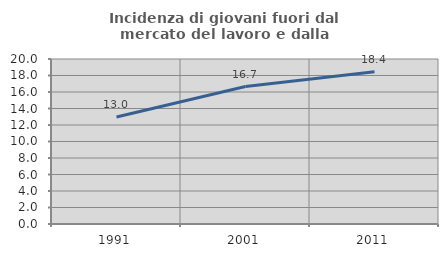
| Category | Incidenza di giovani fuori dal mercato del lavoro e dalla formazione  |
|---|---|
| 1991.0 | 12.971 |
| 2001.0 | 16.667 |
| 2011.0 | 18.447 |